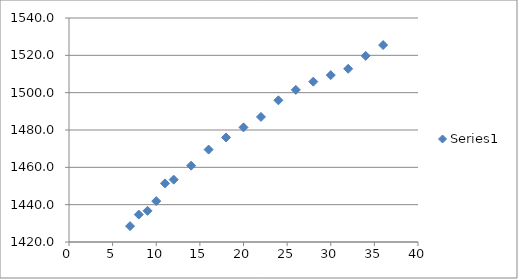
| Category | Series 0 |
|---|---|
| 7.0 | 1428.5 |
| 8.0 | 1434.7 |
| 9.0 | 1436.7 |
| 10.0 | 1441.9 |
| 11.0 | 1451.4 |
| 12.0 | 1453.4 |
| 14.0 | 1460.9 |
| 16.0 | 1469.5 |
| 18.0 | 1476 |
| 20.0 | 1481.4 |
| 22.0 | 1487 |
| 24.0 | 1495.9 |
| 26.0 | 1501.5 |
| 28.0 | 1505.9 |
| 30.0 | 1509.4 |
| 32.0 | 1512.8 |
| 34.0 | 1519.7 |
| 36.0 | 1525.5 |